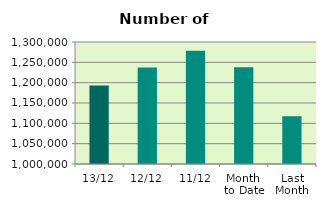
| Category | Series 0 |
|---|---|
| 13/12 | 1193220 |
| 12/12 | 1237264 |
| 11/12 | 1278370 |
| Month 
to Date | 1237850.889 |
| Last
Month | 1117514.364 |